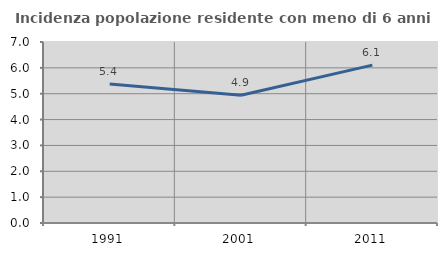
| Category | Incidenza popolazione residente con meno di 6 anni |
|---|---|
| 1991.0 | 5.375 |
| 2001.0 | 4.937 |
| 2011.0 | 6.106 |